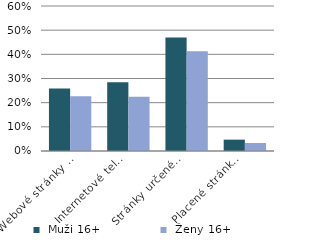
| Category |  Muži 16+ |  Ženy 16+ |
|---|---|---|
| Webové stránky běžných TV stanic | 0.259 | 0.227 |
| Internetové televize
(např. Stream) | 0.285 | 0.225 |
| Stránky určené ke sdílení
(např. YouTube) | 0.47 | 0.413 |
| Placené stránky
(např. Netflix) | 0.047 | 0.033 |